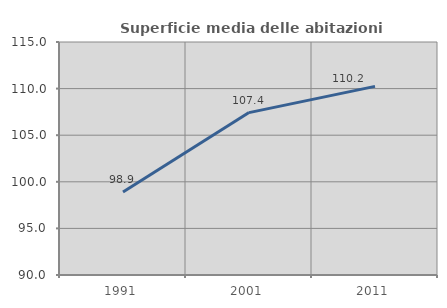
| Category | Superficie media delle abitazioni occupate |
|---|---|
| 1991.0 | 98.914 |
| 2001.0 | 107.425 |
| 2011.0 | 110.24 |